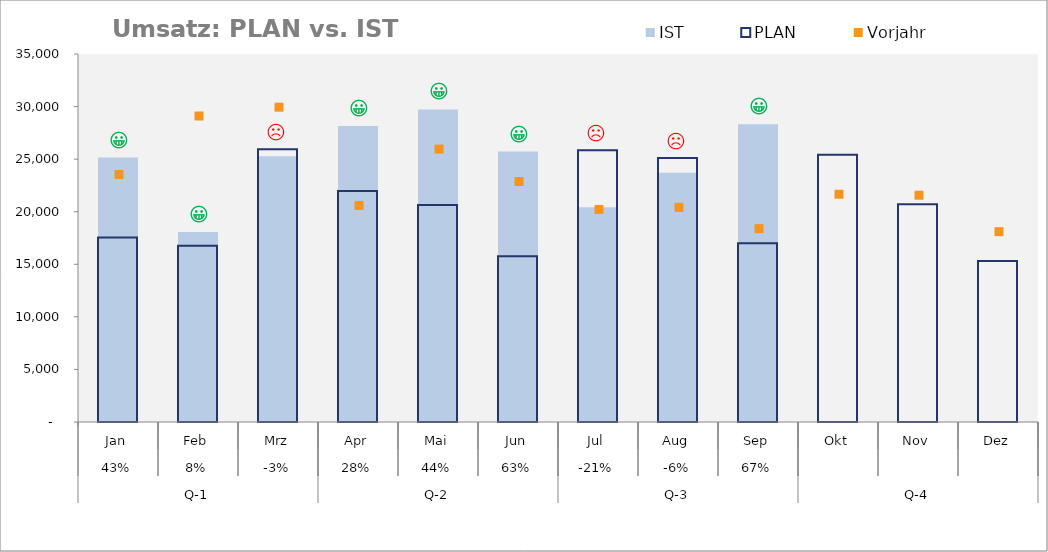
| Category | IST | PLAN |
|---|---|---|
| 0 | 25149 | 17554 |
| 1 | 18070 | 16762 |
| 2 | 25268 | 25940 |
| 3 | 28148 | 21978 |
| 4 | 29732 | 20635 |
| 5 | 25720 | 15756 |
| 6 | 20421 | 25850 |
| 7 | 23717 | 25111 |
| 8 | 28321 | 16999 |
| 9 | 0 | 25407 |
| 10 | 0 | 20712 |
| 11 | 0 | 15324 |